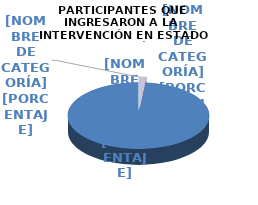
| Category | N° |
|---|---|
| Si | 18 |
| No | 1102 |
| Sin información | 0 |